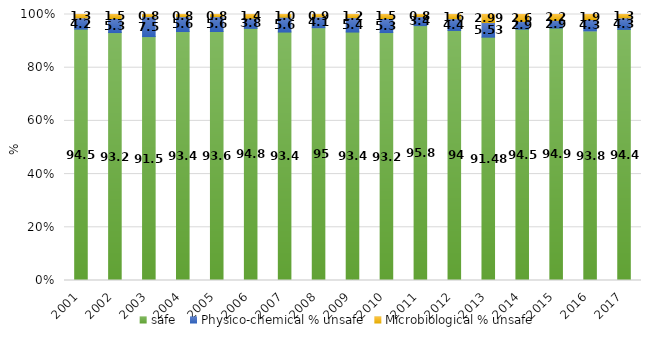
| Category | safe | Physico-chemical | Microbiological |
|---|---|---|---|
| 2001.0 | 94.5 | 4.2 | 1.3 |
| 2002.0 | 93.2 | 5.3 | 1.5 |
| 2003.0 | 91.5 | 7.5 | 0.8 |
| 2004.0 | 93.4 | 5.6 | 0.8 |
| 2005.0 | 93.6 | 5.6 | 0.8 |
| 2006.0 | 94.8 | 3.8 | 1.4 |
| 2007.0 | 93.4 | 5.6 | 1 |
| 2008.0 | 95 | 4.1 | 0.9 |
| 2009.0 | 93.4 | 5.4 | 1.2 |
| 2010.0 | 93.2 | 5.3 | 1.5 |
| 2011.0 | 95.8 | 3.4 | 0.8 |
| 2012.0 | 94 | 4.4 | 1.6 |
| 2013.0 | 91.48 | 5.53 | 2.99 |
| 2014.0 | 94.5 | 2.9 | 2.6 |
| 2015.0 | 94.9 | 2.9 | 2.2 |
| 2016.0 | 93.8 | 4.3 | 1.9 |
| 2017.0 | 94.4 | 4.3 | 1.3 |